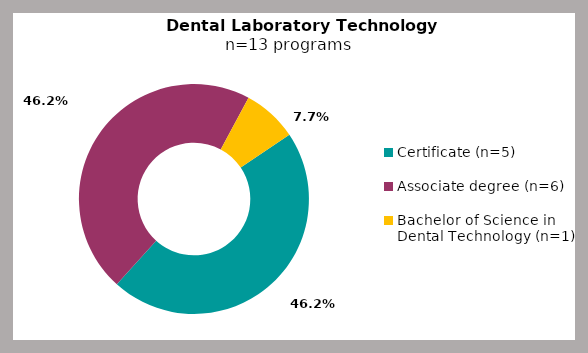
| Category | Series 0 |
|---|---|
| Certificate (n=5) | 0.462 |
| Associate degree (n=6) | 0.462 |
| Bachelor of Science in Dental Technology (n=1) | 0.077 |